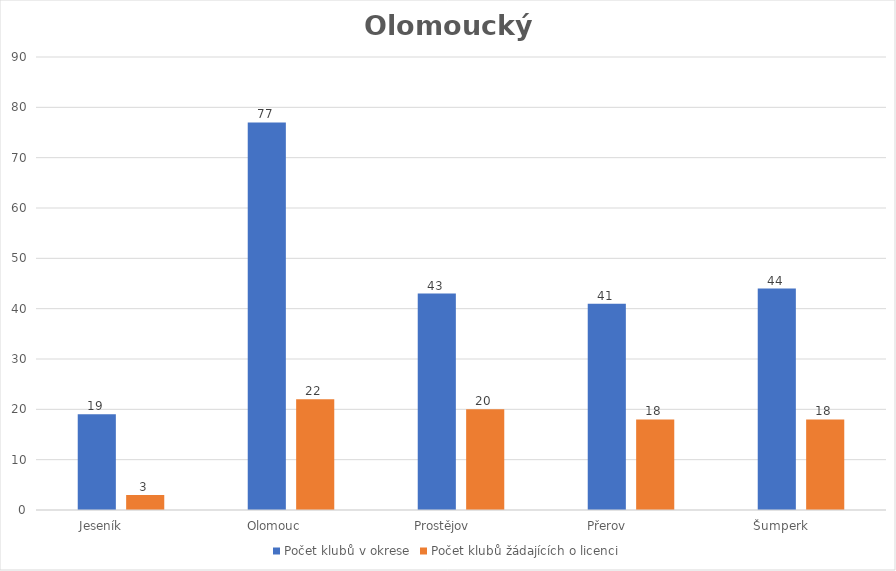
| Category | Počet klubů v okrese | Počet klubů žádajících o licenci |
|---|---|---|
| Jeseník           | 19 | 3 |
| Olomouc         | 77 | 22 |
| Prostějov          | 43 | 20 |
| Přerov             | 41 | 18 |
| Šumperk           | 44 | 18 |